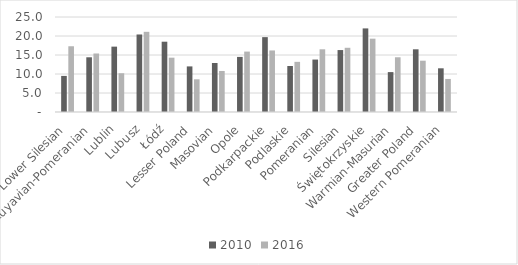
| Category | 2010 | 2016 |
|---|---|---|
| Lower Silesian | 9.5 | 17.3 |
| Kuyavian-Pomeranian | 14.4 | 15.4 |
| Lublin | 17.2 | 10.2 |
| Lubusz | 20.4 | 21.1 |
| Łódź | 18.5 | 14.3 |
| Lesser Poland | 12 | 8.6 |
| Masovian | 12.9 | 10.8 |
| Opole | 14.5 | 15.9 |
| Podkarpackie | 19.7 | 16.2 |
| Podlaskie | 12.1 | 13.2 |
| Pomeranian | 13.8 | 16.5 |
| Silesian | 16.3 | 16.9 |
| Świętokrzyskie | 22 | 19.3 |
| Warmian-Masurian | 10.5 | 14.4 |
| Greater Poland | 16.5 | 13.5 |
| Western Pomeranian | 11.5 | 8.7 |